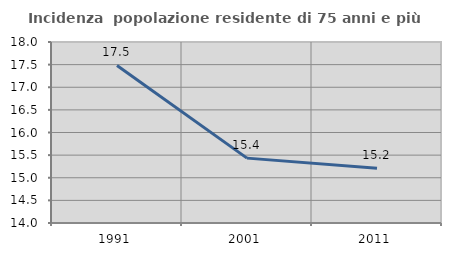
| Category | Incidenza  popolazione residente di 75 anni e più |
|---|---|
| 1991.0 | 17.482 |
| 2001.0 | 15.434 |
| 2011.0 | 15.21 |